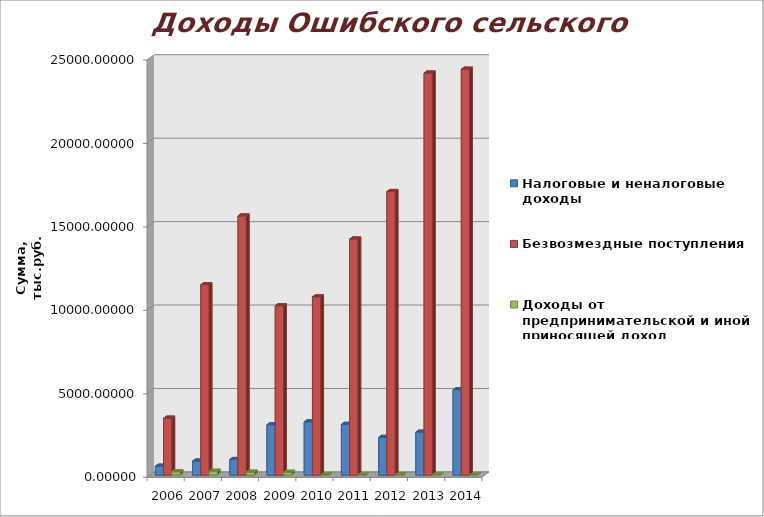
| Category | Налоговые и неналоговые доходы | Безвозмездные поступления | Доходы от предпринимательской и иной приносящей доход деятельности |
|---|---|---|---|
| 2006 | 530.26 | 3408.14 | 203.1 |
| 2007 | 836.3 | 11408.8 | 225.7 |
| 2008 | 932 | 15526.08 | 171 |
| 2009 | 3014.96 | 10146.75 | 164.99 |
| 2010 | 3183.693 | 10675.088 | 0 |
| 2011 | 3034.772 | 14142.092 | 0 |
| 2012 | 2255.471 | 16990.443 | 0 |
| 2013 | 2566.966 | 24090.331 | 0 |
| 2014 | 5117.251 | 24320.692 | 0 |